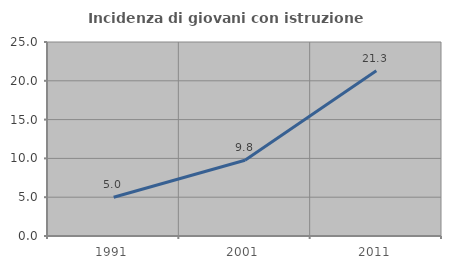
| Category | Incidenza di giovani con istruzione universitaria |
|---|---|
| 1991.0 | 5 |
| 2001.0 | 9.756 |
| 2011.0 | 21.287 |